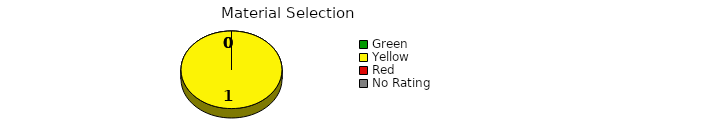
| Category | Counts |
|---|---|
| Green | 0 |
| Yellow | 1 |
| Red | 0 |
| No Rating | 0 |